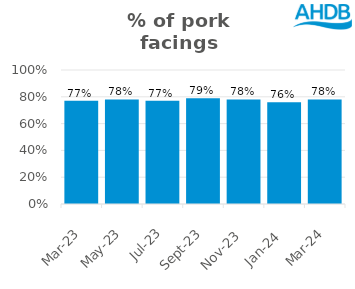
| Category | Pork |
|---|---|
| 2023-03-01 | 0.77 |
| 2023-05-01 | 0.78 |
| 2023-07-01 | 0.77 |
| 2023-09-01 | 0.79 |
| 2023-11-01 | 0.78 |
| 2024-01-01 | 0.76 |
| 2024-03-01 | 0.78 |